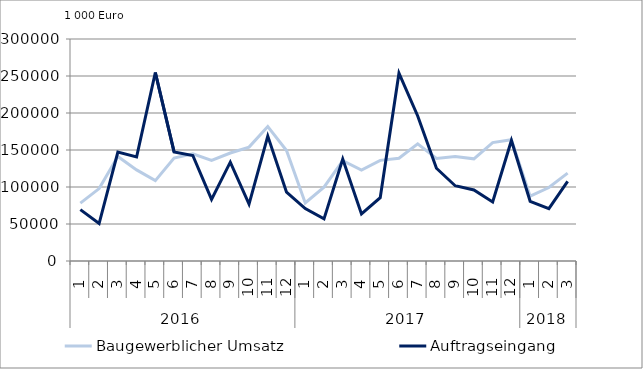
| Category | Baugewerblicher Umsatz | Auftragseingang |
|---|---|---|
| 0 | 78291.738 | 69470.357 |
| 1 | 97863.379 | 50640.033 |
| 2 | 141176.119 | 147206.65 |
| 3 | 123121.297 | 140579.009 |
| 4 | 108561.124 | 254739.334 |
| 5 | 139030.209 | 147481.644 |
| 6 | 144784.416 | 142609.658 |
| 7 | 135870.195 | 83192.156 |
| 8 | 145961.738 | 133594.351 |
| 9 | 153886.826 | 76793.838 |
| 10 | 181740.037 | 168867.568 |
| 11 | 149348.138 | 93011.853 |
| 12 | 78446.78 | 70908.903 |
| 13 | 99841.908 | 56868.408 |
| 14 | 135679.867 | 137790.423 |
| 15 | 123004.403 | 63637.761 |
| 16 | 136010.071 | 85644.63 |
| 17 | 138859.308 | 253791.552 |
| 18 | 158353.879 | 196034.198 |
| 19 | 138510.315 | 125319.873 |
| 20 | 141109.925 | 101690.626 |
| 21 | 138067.098 | 95966.626 |
| 22 | 160064.454 | 79701.993 |
| 23 | 163969.017 | 162878.607 |
| 24 | 87640.529 | 80684.627 |
| 25 | 99259.455 | 70746.763 |
| 26 | 118764.324 | 107538.747 |